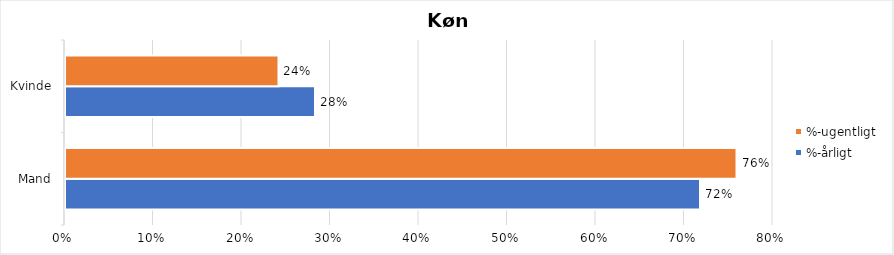
| Category | %-årligt | %-ugentligt |
|---|---|---|
| Mand | 0.718 | 0.759 |
| Kvinde | 0.282 | 0.241 |